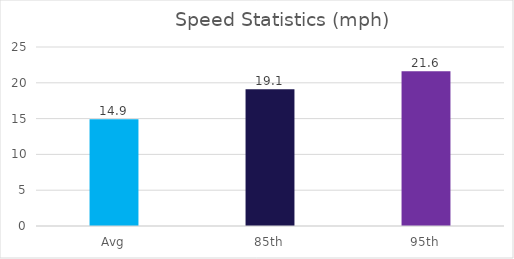
| Category | Series 0 |
|---|---|
| Avg | 14.9 |
| 85th | 19.1 |
| 95th | 21.6 |